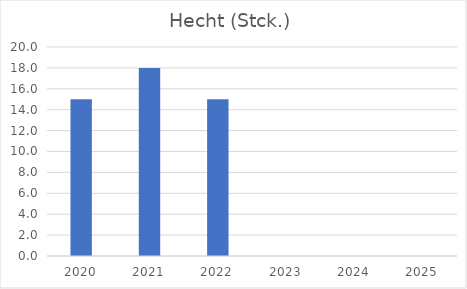
| Category | Hecht (Stck.) |
|---|---|
| 2020.0 | 15 |
| 2021.0 | 18 |
| 2022.0 | 15 |
| 2023.0 | 0 |
| 2024.0 | 0 |
| 2025.0 | 0 |